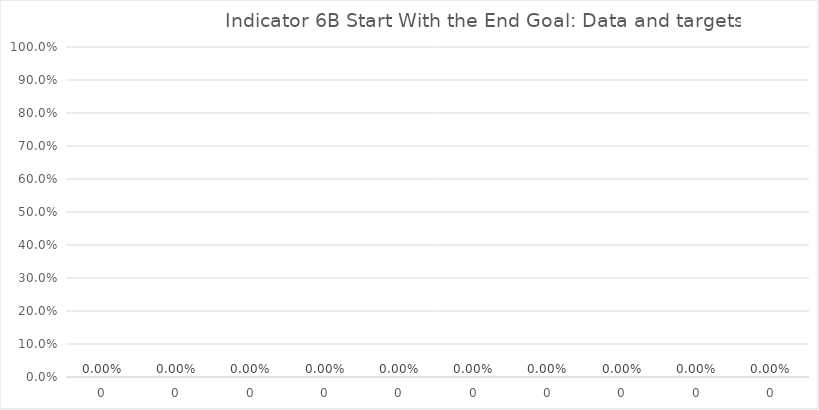
| Category | Indicator 6B data and targets |
|---|---|
| 0.0 | 0 |
| 0.0 | 0 |
| 0.0 | 0 |
| 0.0 | 0 |
| 0.0 | 0 |
| 0.0 | 0 |
| 0.0 | 0 |
| 0.0 | 0 |
| 0.0 | 0 |
| 0.0 | 0 |